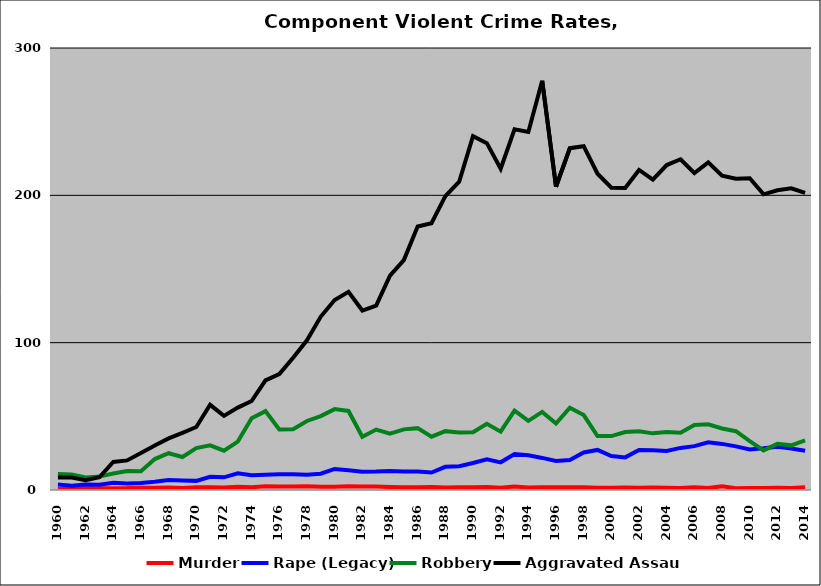
| Category | Murder | Rape (Legacy) | Robbery | Aggravated Assault |
|---|---|---|---|---|
| 1960.0 | 0.616 | 3.699 | 10.916 | 8.558 |
| 1961.0 | 1.295 | 2.915 | 10.471 | 8.456 |
| 1962.0 | 1.116 | 3.781 | 8.57 | 6.662 |
| 1963.0 | 1.259 | 3.597 | 9.101 | 8.669 |
| 1964.0 | 1.27 | 4.971 | 11.248 | 19.049 |
| 1965.0 | 1.304 | 4.457 | 12.826 | 20.072 |
| 1966.0 | 1.565 | 4.805 | 12.778 | 25.046 |
| 1967.0 | 1.526 | 5.63 | 20.995 | 30.258 |
| 1968.0 | 1.747 | 6.769 | 24.964 | 35.007 |
| 1969.0 | 1.402 | 6.401 | 22.366 | 38.799 |
| 1970.0 | 1.911 | 6.195 | 28.46 | 42.76 |
| 1971.0 | 1.823 | 8.941 | 30.365 | 57.819 |
| 1972.0 | 1.734 | 8.602 | 26.708 | 50.33 |
| 1973.0 | 2.169 | 11.329 | 32.851 | 55.923 |
| 1974.0 | 1.891 | 10.053 | 48.687 | 60.385 |
| 1975.0 | 2.474 | 10.348 | 53.519 | 74.39 |
| 1976.0 | 2.334 | 10.697 | 41.115 | 78.711 |
| 1977.0 | 2.327 | 10.629 | 41.23 | 89.788 |
| 1978.0 | 2.555 | 10.359 | 46.858 | 101.623 |
| 1979.0 | 2.239 | 11.023 | 50.189 | 117.706 |
| 1980.0 | 2.167 | 14.306 | 54.887 | 128.998 |
| 1981.0 | 2.623 | 13.428 | 53.642 | 134.484 |
| 1982.0 | 2.306 | 12.461 | 36.179 | 121.79 |
| 1983.0 | 2.341 | 12.565 | 41.033 | 125.198 |
| 1984.0 | 2.027 | 12.887 | 38.282 | 145.464 |
| 1985.0 | 1.907 | 12.587 | 41.158 | 156.068 |
| 1986.0 | 1.789 | 12.487 | 41.985 | 178.85 |
| 1987.0 | 2.082 | 11.891 | 36.168 | 181.087 |
| 1988.0 | 1.658 | 15.737 | 39.944 | 199.506 |
| 1989.0 | 1.901 | 16.162 | 39.014 | 209.225 |
| 1990.0 | 1.945 | 18.367 | 39.218 | 240.136 |
| 1991.0 | 2.039 | 20.859 | 44.973 | 235.42 |
| 1992.0 | 1.565 | 18.777 | 39.58 | 218.03 |
| 1993.0 | 2.345 | 24.378 | 53.909 | 244.847 |
| 1994.0 | 1.661 | 23.542 | 46.907 | 242.983 |
| 1995.0 | 1.795 | 21.78 | 53.026 | 277.762 |
| 1996.0 | 1.858 | 19.67 | 45.091 | 205.856 |
| 1997.0 | 1.823 | 20.302 | 55.856 | 232.013 |
| 1998.0 | 1.887 | 25.437 | 50.874 | 233.333 |
| 1999.0 | 1.499 | 27.183 | 36.628 | 214.678 |
| 2000.0 | 1.572 | 23.101 | 36.599 | 205.138 |
| 2001.0 | 1.705 | 22.135 | 39.359 | 205.05 |
| 2002.0 | 1.499 | 27.147 | 39.818 | 217.246 |
| 2003.0 | 1.7 | 27.057 | 38.444 | 210.675 |
| 2004.0 | 1.49 | 26.482 | 39.283 | 220.563 |
| 2005.0 | 1.349 | 28.562 | 38.88 | 224.48 |
| 2006.0 | 1.911 | 29.778 | 44.164 | 215.151 |
| 2007.0 | 1.339 | 32.396 | 44.578 | 222.386 |
| 2008.0 | 2.572 | 31.296 | 41.717 | 213.361 |
| 2009.0 | 1.263 | 29.589 | 39.929 | 211.313 |
| 2010.0 | 1.28 | 27.443 | 33.187 | 211.63 |
| 2011.0 | 1.436 | 28.263 | 26.892 | 200.679 |
| 2012.0 | 1.593 | 29.3 | 31.284 | 203.412 |
| 2013.0 | 1.326 | 28.231 | 30.301 | 204.764 |
| 2014.0 | 1.931 | 26.648 | 33.632 | 201.601 |